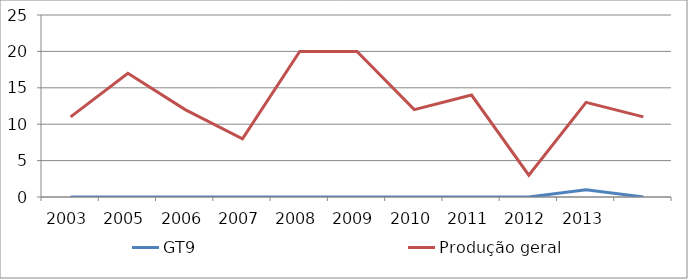
| Category | GT9 | Produção geral |
|---|---|---|
| 2003.0 | 0 | 11 |
| 2005.0 | 0 | 17 |
| 2006.0 | 0 | 12 |
| 2007.0 | 0 | 8 |
| 2008.0 | 0 | 20 |
| 2009.0 | 0 | 20 |
| 2010.0 | 0 | 12 |
| 2011.0 | 0 | 14 |
| 2012.0 | 0 | 3 |
| 2013.0 | 1 | 13 |